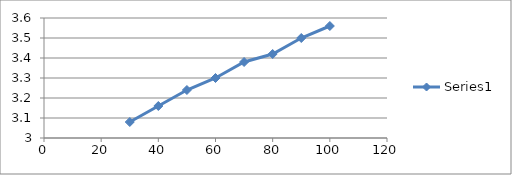
| Category | Series 0 |
|---|---|
| 100.0 | 3.56 |
| 90.0 | 3.5 |
| 80.0 | 3.42 |
| 70.0 | 3.38 |
| 60.0 | 3.3 |
| 50.0 | 3.24 |
| 40.0 | 3.16 |
| 30.0 | 3.08 |